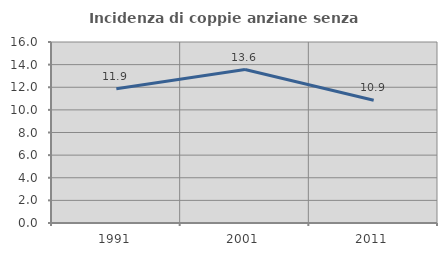
| Category | Incidenza di coppie anziane senza figli  |
|---|---|
| 1991.0 | 11.871 |
| 2001.0 | 13.565 |
| 2011.0 | 10.856 |